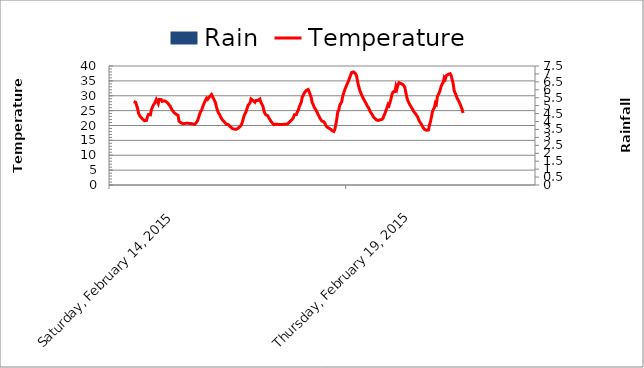
| Category | Rain |
|---|---|
| 2/15/15 | 0 |
| 2/15/15 | 0 |
| 2/15/15 | 0 |
| 2/15/15 | 0 |
| 2/15/15 | 0 |
| 2/15/15 | 0 |
| 2/15/15 | 0 |
| 2/15/15 | 0 |
| 2/15/15 | 0 |
| 2/15/15 | 0 |
| 2/15/15 | 0 |
| 2/15/15 | 0 |
| 2/15/15 | 0 |
| 2/15/15 | 0 |
| 2/15/15 | 0 |
| 2/15/15 | 0 |
| 2/15/15 | 0 |
| 2/15/15 | 0 |
| 2/15/15 | 0 |
| 2/15/15 | 0 |
| 2/15/15 | 0 |
| 2/15/15 | 0 |
| 2/15/15 | 0 |
| 2/15/15 | 0 |
| 2/15/15 | 0 |
| 2/15/15 | 0 |
| 2/15/15 | 0 |
| 2/15/15 | 0 |
| 2/15/15 | 0 |
| 2/15/15 | 0 |
| 2/15/15 | 0 |
| 2/15/15 | 0 |
| 2/15/15 | 0 |
| 2/15/15 | 0 |
| 2/15/15 | 0 |
| 2/15/15 | 0 |
| 2/15/15 | 0 |
| 2/15/15 | 0 |
| 2/15/15 | 0 |
| 2/15/15 | 0 |
| 2/15/15 | 0 |
| 2/15/15 | 0 |
| 2/15/15 | 0 |
| 2/15/15 | 0 |
| 2/15/15 | 0 |
| 2/15/15 | 0 |
| 2/15/15 | 2.4 |
| 2/16/15 | 0 |
| 2/16/15 | 0 |
| 2/16/15 | 0.2 |
| 2/16/15 | 0 |
| 2/16/15 | 0 |
| 2/16/15 | 0 |
| 2/16/15 | 0 |
| 2/16/15 | 0 |
| 2/16/15 | 0 |
| 2/16/15 | 0 |
| 2/16/15 | 0 |
| 2/16/15 | 0 |
| 2/16/15 | 0 |
| 2/16/15 | 0 |
| 2/16/15 | 0 |
| 2/16/15 | 0 |
| 2/16/15 | 0 |
| 2/16/15 | 0 |
| 2/16/15 | 0 |
| 2/16/15 | 0 |
| 2/16/15 | 0 |
| 2/16/15 | 0 |
| 2/16/15 | 0 |
| 2/16/15 | 0 |
| 2/16/15 | 0 |
| 2/16/15 | 0 |
| 2/16/15 | 0 |
| 2/16/15 | 0 |
| 2/16/15 | 0 |
| 2/16/15 | 0 |
| 2/16/15 | 0 |
| 2/16/15 | 0 |
| 2/16/15 | 0 |
| 2/16/15 | 0 |
| 2/16/15 | 0 |
| 2/16/15 | 0 |
| 2/16/15 | 0 |
| 2/16/15 | 0 |
| 2/16/15 | 0 |
| 2/16/15 | 0 |
| 2/16/15 | 0 |
| 2/16/15 | 0 |
| 2/16/15 | 0 |
| 2/16/15 | 0 |
| 2/16/15 | 0 |
| 2/16/15 | 0 |
| 2/16/15 | 0 |
| 2/16/15 | 0 |
| 2/17/15 | 0 |
| 2/17/15 | 0 |
| 2/17/15 | 0 |
| 2/17/15 | 0 |
| 2/17/15 | 0 |
| 2/17/15 | 0 |
| 2/17/15 | 0 |
| 2/17/15 | 0 |
| 2/17/15 | 0 |
| 2/17/15 | 0 |
| 2/17/15 | 0 |
| 2/17/15 | 0 |
| 2/17/15 | 0 |
| 2/17/15 | 0 |
| 2/17/15 | 0 |
| 2/17/15 | 0 |
| 2/17/15 | 0 |
| 2/17/15 | 0 |
| 2/17/15 | 0 |
| 2/17/15 | 0 |
| 2/17/15 | 0 |
| 2/17/15 | 0 |
| 2/17/15 | 0 |
| 2/17/15 | 0 |
| 2/17/15 | 0 |
| 2/17/15 | 0 |
| 2/17/15 | 0 |
| 2/17/15 | 0 |
| 2/17/15 | 0 |
| 2/17/15 | 0 |
| 2/17/15 | 0 |
| 2/17/15 | 0 |
| 2/17/15 | 0 |
| 2/17/15 | 0 |
| 2/17/15 | 0 |
| 2/17/15 | 0 |
| 2/17/15 | 0 |
| 2/17/15 | 0 |
| 2/17/15 | 0 |
| 2/17/15 | 0 |
| 2/17/15 | 0 |
| 2/17/15 | 0 |
| 2/17/15 | 0 |
| 2/17/15 | 0 |
| 2/17/15 | 0 |
| 2/17/15 | 0 |
| 2/17/15 | 0 |
| 2/17/15 | 0 |
| 2/18/15 | 0 |
| 2/18/15 | 0 |
| 2/18/15 | 0 |
| 2/18/15 | 0 |
| 2/18/15 | 0 |
| 2/18/15 | 0 |
| 2/18/15 | 0 |
| 2/18/15 | 0 |
| 2/18/15 | 0 |
| 2/18/15 | 0 |
| 2/18/15 | 0 |
| 2/18/15 | 0 |
| 2/18/15 | 0 |
| 2/18/15 | 0 |
| 2/18/15 | 0 |
| 2/18/15 | 0 |
| 2/18/15 | 0 |
| 2/18/15 | 0 |
| 2/18/15 | 0 |
| 2/18/15 | 0 |
| 2/18/15 | 0 |
| 2/18/15 | 0 |
| 2/18/15 | 0 |
| 2/18/15 | 0 |
| 2/18/15 | 0 |
| 2/18/15 | 0 |
| 2/18/15 | 0 |
| 2/18/15 | 0 |
| 2/18/15 | 0 |
| 2/18/15 | 0 |
| 2/18/15 | 0 |
| 2/18/15 | 0 |
| 2/18/15 | 0 |
| 2/18/15 | 0 |
| 2/18/15 | 0 |
| 2/18/15 | 0 |
| 2/18/15 | 0 |
| 2/18/15 | 0 |
| 2/18/15 | 0 |
| 2/18/15 | 0 |
| 2/18/15 | 0 |
| 2/18/15 | 0 |
| 2/18/15 | 0 |
| 2/18/15 | 0 |
| 2/18/15 | 0 |
| 2/18/15 | 0 |
| 2/18/15 | 0 |
| 2/18/15 | 0 |
| 2/19/15 | 0 |
| 2/19/15 | 0 |
| 2/19/15 | 0 |
| 2/19/15 | 0 |
| 2/19/15 | 0 |
| 2/19/15 | 0 |
| 2/19/15 | 0 |
| 2/19/15 | 0 |
| 2/19/15 | 0 |
| 2/19/15 | 0 |
| 2/19/15 | 0 |
| 2/19/15 | 0 |
| 2/19/15 | 0 |
| 2/19/15 | 0 |
| 2/19/15 | 0 |
| 2/19/15 | 0 |
| 2/19/15 | 0 |
| 2/19/15 | 0 |
| 2/19/15 | 0 |
| 2/19/15 | 0 |
| 2/19/15 | 0 |
| 2/19/15 | 0 |
| 2/19/15 | 0 |
| 2/19/15 | 0 |
| 2/19/15 | 0 |
| 2/19/15 | 0 |
| 2/19/15 | 0 |
| 2/19/15 | 0 |
| 2/19/15 | 0 |
| 2/19/15 | 0 |
| 2/19/15 | 0 |
| 2/19/15 | 0 |
| 2/19/15 | 0 |
| 2/19/15 | 0 |
| 2/19/15 | 0 |
| 2/19/15 | 0 |
| 2/19/15 | 0 |
| 2/19/15 | 0 |
| 2/19/15 | 0 |
| 2/19/15 | 0 |
| 2/19/15 | 0 |
| 2/19/15 | 0 |
| 2/19/15 | 0 |
| 2/19/15 | 0 |
| 2/19/15 | 0 |
| 2/19/15 | 0 |
| 2/19/15 | 0 |
| 2/19/15 | 0 |
| 2/20/15 | 0 |
| 2/20/15 | 0 |
| 2/20/15 | 0 |
| 2/20/15 | 0 |
| 2/20/15 | 0 |
| 2/20/15 | 0 |
| 2/20/15 | 0 |
| 2/20/15 | 0 |
| 2/20/15 | 0 |
| 2/20/15 | 0 |
| 2/20/15 | 0 |
| 2/20/15 | 0 |
| 2/20/15 | 0 |
| 2/20/15 | 0 |
| 2/20/15 | 0 |
| 2/20/15 | 0 |
| 2/20/15 | 0 |
| 2/20/15 | 0 |
| 2/20/15 | 0 |
| 2/20/15 | 0 |
| 2/20/15 | 0 |
| 2/20/15 | 0 |
| 2/20/15 | 0 |
| 2/20/15 | 0 |
| 2/20/15 | 0 |
| 2/20/15 | 0 |
| 2/20/15 | 0 |
| 2/20/15 | 0 |
| 2/20/15 | 0 |
| 2/20/15 | 0 |
| 2/20/15 | 0 |
| 2/20/15 | 0 |
| 2/20/15 | 0 |
| 2/20/15 | 0 |
| 2/20/15 | 0 |
| 2/20/15 | 0 |
| 2/20/15 | 0 |
| 2/20/15 | 0 |
| 2/20/15 | 0 |
| 2/20/15 | 0 |
| 2/20/15 | 0 |
| 2/20/15 | 0 |
| 2/20/15 | 0 |
| 2/20/15 | 0 |
| 2/20/15 | 0 |
| 2/20/15 | 0 |
| 2/20/15 | 0 |
| 2/20/15 | 0 |
| 2/21/15 | 0 |
| 2/21/15 | 0 |
| 2/21/15 | 0 |
| 2/21/15 | 0 |
| 2/21/15 | 0 |
| 2/21/15 | 0 |
| 2/21/15 | 0 |
| 2/21/15 | 0 |
| 2/21/15 | 0 |
| 2/21/15 | 0 |
| 2/21/15 | 0 |
| 2/21/15 | 0 |
| 2/21/15 | 0 |
| 2/21/15 | 0 |
| 2/21/15 | 0 |
| 2/21/15 | 0 |
| 2/21/15 | 0 |
| 2/21/15 | 0 |
| 2/21/15 | 0 |
| 2/21/15 | 0 |
| 2/21/15 | 0 |
| 2/21/15 | 0 |
| 2/21/15 | 0 |
| 2/21/15 | 0 |
| 2/21/15 | 0 |
| 2/21/15 | 0 |
| 2/21/15 | 0 |
| 2/21/15 | 0 |
| 2/21/15 | 0 |
| 2/21/15 | 0 |
| 2/21/15 | 0 |
| 2/21/15 | 0 |
| 2/21/15 | 0 |
| 2/21/15 | 0 |
| 2/21/15 | 0 |
| 2/21/15 | 0 |
| 2/21/15 | 0 |
| 2/21/15 | 0 |
| 2/21/15 | 0 |
| 2/21/15 | 0 |
| 2/21/15 | 0 |
| 2/21/15 | 0 |
| 2/21/15 | 0 |
| 2/21/15 | 0 |
| 2/21/15 | 0 |
| 2/21/15 | 0 |
| 2/21/15 | 0 |
| 2/21/15 | 0 |